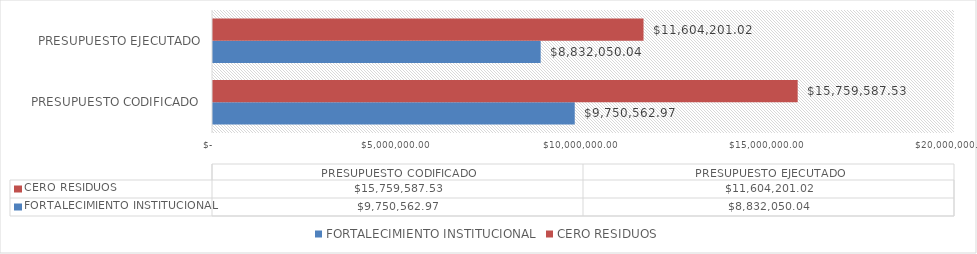
| Category | FORTALECIMIENTO INSTITUCIONAL | CERO RESIDUOS |
|---|---|---|
| PRESUPUESTO CODIFICADO | 9750562.97 | 15759587.53 |
| PRESUPUESTO EJECUTADO | 8832050.04 | 11604201.02 |